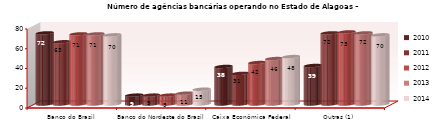
| Category | 2010 | 2011 | 2012 | 2013 | 2014 |
|---|---|---|---|---|---|
| Banco do Brasil | 72 | 63 | 71 | 71 | 70 |
| Banco do Nordeste do Brasil | 9 | 9 | 9 | 11 | 15 |
| Caixa Econômica Federal | 38 | 31 | 42 | 46 | 48 |
| Outras (1) | 39 | 72 | 73 | 72 | 70 |